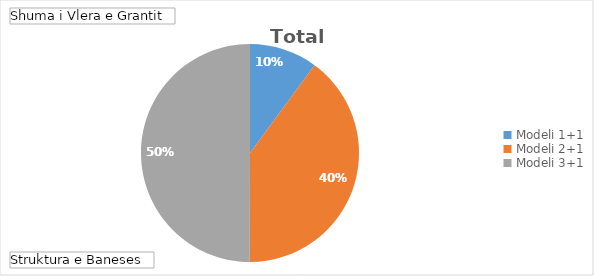
| Category | Total |
|---|---|
| Modeli 1+1 | 52633102 |
| Modeli 2+1 | 208257314 |
| Modeli 3+1 | 260600808 |